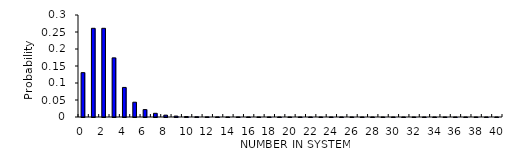
| Category | Series 0 |
|---|---|
| 0.0 | 0.13 |
| 1.0 | 0.261 |
| 2.0 | 0.261 |
| 3.0 | 0.174 |
| 4.0 | 0.087 |
| 5.0 | 0.043 |
| 6.0 | 0.022 |
| 7.0 | 0.011 |
| 8.0 | 0.005 |
| 9.0 | 0.003 |
| 10.0 | 0.001 |
| 11.0 | 0.001 |
| 12.0 | 0 |
| 13.0 | 0 |
| 14.0 | 0 |
| 15.0 | 0 |
| 16.0 | 0 |
| 17.0 | 0 |
| 18.0 | 0 |
| 19.0 | 0 |
| 20.0 | 0 |
| 21.0 | 0 |
| 22.0 | 0 |
| 23.0 | 0 |
| 24.0 | 0 |
| 25.0 | 0 |
| 26.0 | 0 |
| 27.0 | 0 |
| 28.0 | 0 |
| 29.0 | 0 |
| 30.0 | 0 |
| 31.0 | 0 |
| 32.0 | 0 |
| 33.0 | 0 |
| 34.0 | 0 |
| 35.0 | 0 |
| 36.0 | 0 |
| 37.0 | 0 |
| 38.0 | 0 |
| 39.0 | 0 |
| 40.0 | 0 |